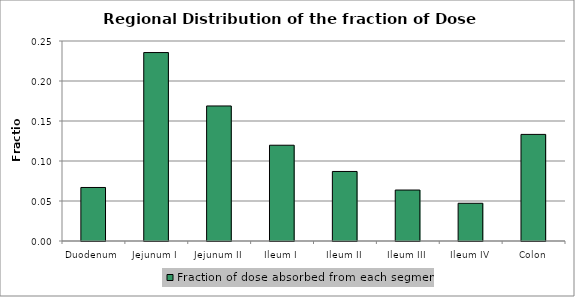
| Category | Fraction of dose absorbed from each segment |
|---|---|
| Duodenum | 0.067 |
| Jejunum I | 0.236 |
| Jejunum II | 0.169 |
| Ileum I | 0.12 |
| Ileum II | 0.087 |
| Ileum III | 0.064 |
| Ileum IV | 0.047 |
| Colon | 0.133 |